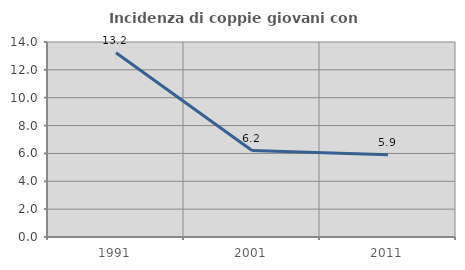
| Category | Incidenza di coppie giovani con figli |
|---|---|
| 1991.0 | 13.228 |
| 2001.0 | 6.206 |
| 2011.0 | 5.911 |